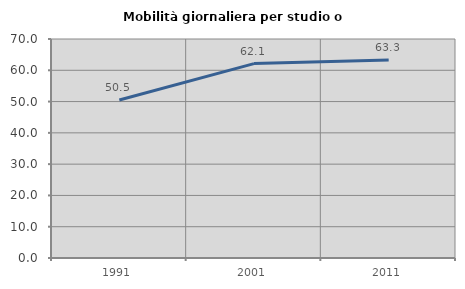
| Category | Mobilità giornaliera per studio o lavoro |
|---|---|
| 1991.0 | 50.513 |
| 2001.0 | 62.133 |
| 2011.0 | 63.271 |